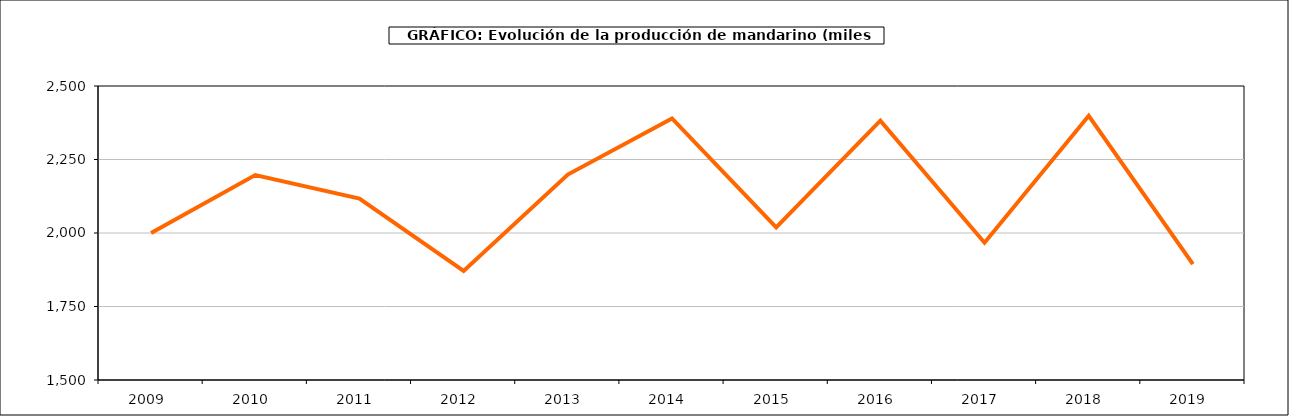
| Category | producción |
|---|---|
| 2009.0 | 2000.149 |
| 2010.0 | 2196.89 |
| 2011.0 | 2117.119 |
| 2012.0 | 1871.265 |
| 2013.0 | 2198.926 |
| 2014.0 | 2389.894 |
| 2015.0 | 2018.755 |
| 2016.0 | 2382.073 |
| 2017.0 | 1967.018 |
| 2018.0 | 2398.621 |
| 2019.0 | 1893.951 |